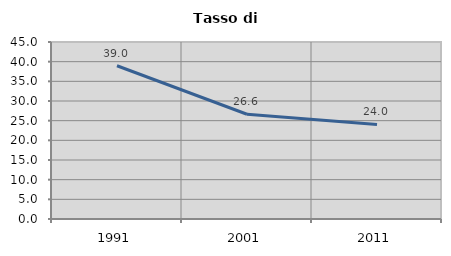
| Category | Tasso di disoccupazione   |
|---|---|
| 1991.0 | 38.959 |
| 2001.0 | 26.627 |
| 2011.0 | 24.047 |